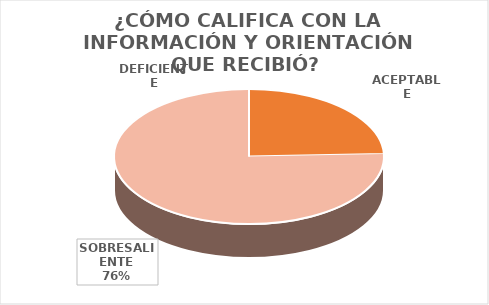
| Category | Series 0 |
|---|---|
| DEFICIENTE | 0 |
| ACEPTABLE | 51 |
| SOBRESALIENTE | 158 |